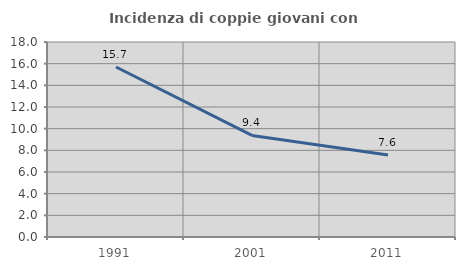
| Category | Incidenza di coppie giovani con figli |
|---|---|
| 1991.0 | 15.689 |
| 2001.0 | 9.377 |
| 2011.0 | 7.571 |